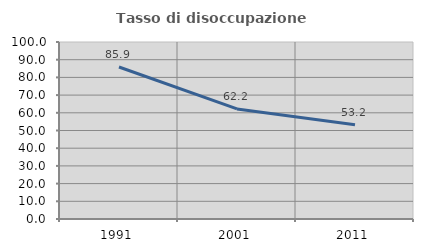
| Category | Tasso di disoccupazione giovanile  |
|---|---|
| 1991.0 | 85.881 |
| 2001.0 | 62.198 |
| 2011.0 | 53.208 |